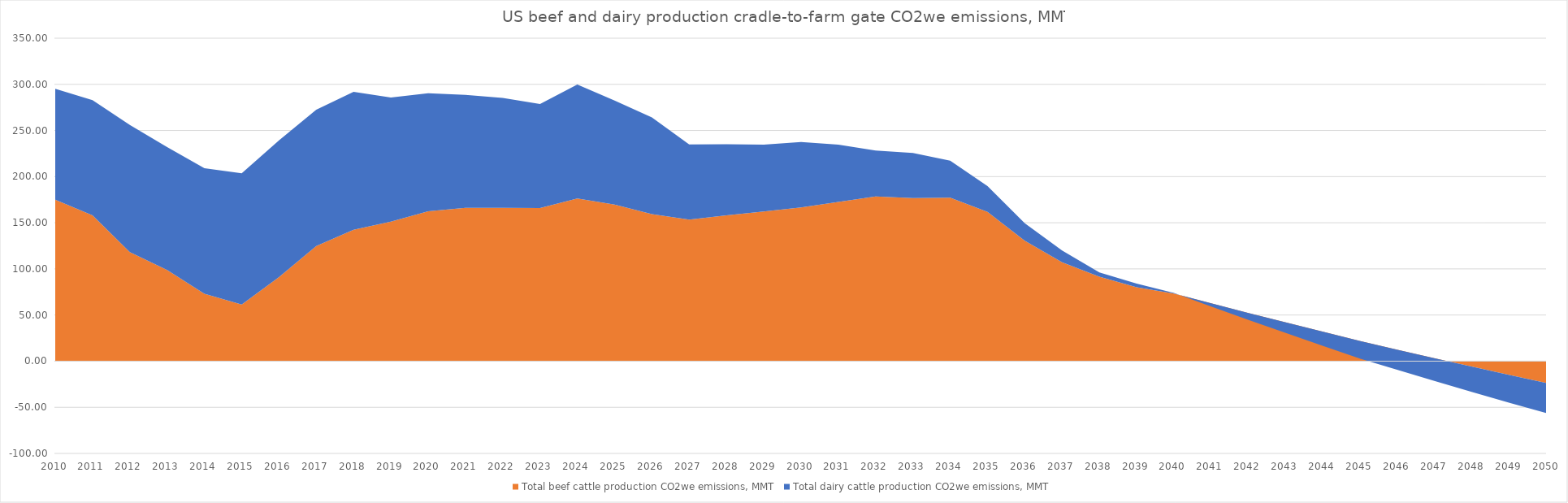
| Category | Total beef cattle production CO2we emissions, MMT | Total dairy cattle production CO2we emissions, MMT |
|---|---|---|
| 2010.0 | 174.906 | 120.197 |
| 2011.0 | 158.127 | 124.739 |
| 2012.0 | 118.079 | 137.947 |
| 2013.0 | 98.873 | 133.187 |
| 2014.0 | 73.153 | 136.037 |
| 2015.0 | 61.465 | 142.073 |
| 2016.0 | 91.005 | 148.167 |
| 2017.0 | 124.825 | 147.748 |
| 2018.0 | 142.426 | 149.511 |
| 2019.0 | 151.181 | 134.472 |
| 2020.0 | 162.491 | 127.904 |
| 2021.0 | 166.061 | 122.502 |
| 2022.0 | 166.061 | 119.126 |
| 2023.0 | 165.942 | 112.777 |
| 2024.0 | 176.295 | 123.448 |
| 2025.0 | 169.75 | 112.701 |
| 2026.0 | 159.275 | 104.825 |
| 2027.0 | 153.449 | 81.377 |
| 2028.0 | 158.102 | 76.866 |
| 2029.0 | 162.169 | 72.491 |
| 2030.0 | 166.719 | 70.751 |
| 2031.0 | 172.54 | 62.012 |
| 2032.0 | 178.554 | 49.638 |
| 2033.0 | 176.789 | 48.74 |
| 2034.0 | 177.121 | 40.159 |
| 2035.0 | 161.818 | 27.821 |
| 2036.0 | 130.521 | 18.866 |
| 2037.0 | 107.15 | 12.698 |
| 2038.0 | 91.585 | 4.556 |
| 2039.0 | 80.135 | 3.841 |
| 2040.0 | 73.277 | 0.685 |
| 2041.0 | 62.65 | -3.422 |
| 2042.0 | 52.191 | -7.459 |
| 2043.0 | 41.898 | -11.426 |
| 2044.0 | 31.767 | -15.326 |
| 2045.0 | 21.797 | -19.158 |
| 2046.0 | 12.388 | -21.985 |
| 2047.0 | 3.132 | -24.76 |
| 2048.0 | -5.974 | -27.483 |
| 2049.0 | -14.931 | -30.156 |
| 2050.0 | -23.742 | -32.778 |